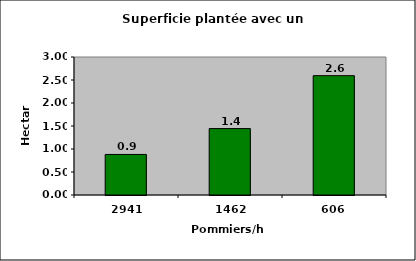
| Category | Series 0 |
|---|---|
| 2941.1764705882356 | 0.881 |
| 1461.988304093567 | 1.444 |
| 606.0606060606061 | 2.594 |